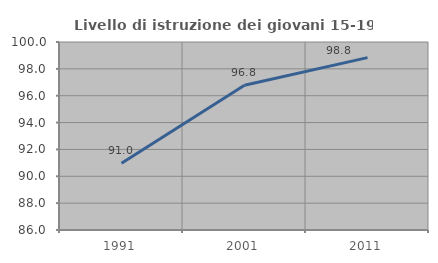
| Category | Livello di istruzione dei giovani 15-19 anni |
|---|---|
| 1991.0 | 90.971 |
| 2001.0 | 96.779 |
| 2011.0 | 98.837 |